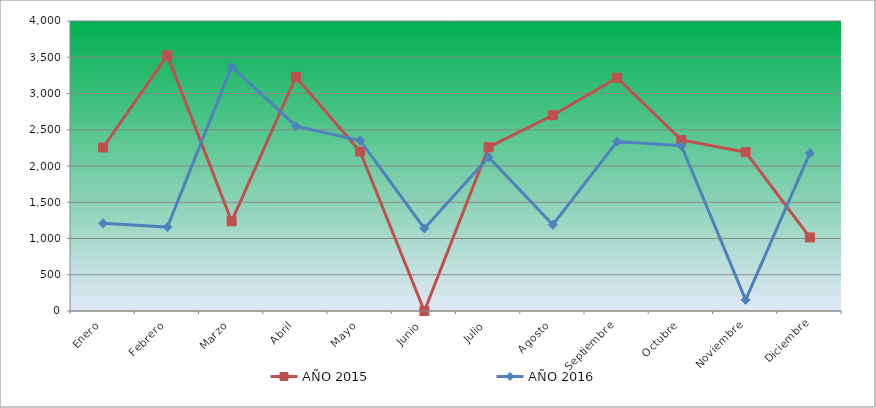
| Category | AÑO 2015 | AÑO 2016 |
|---|---|---|
| Enero | 2255.021 | 1210.017 |
| Febrero | 3527 | 1157.152 |
| Marzo | 1237.371 | 3370.118 |
| Abril | 3228.625 | 2549.258 |
| Mayo | 2200.091 | 2351.917 |
| Junio | 0 | 1139.53 |
| Julio | 2259.865 | 2122.195 |
| Agosto | 2700.247 | 1189.458 |
| Septiembre | 3216.536 | 2337.799 |
| Octubre | 2359.099 | 2279.06 |
| Noviembre | 2190.406 | 153.148 |
| Diciembre | 1014.76 | 2176.268 |